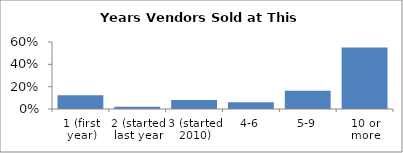
| Category | Series 0 |
|---|---|
| 1 (first year) | 0.122 |
| 2 (started last year | 0.02 |
| 3 (started 2010) | 0.082 |
| 4-6 | 0.061 |
| 5-9 | 0.163 |
| 10 or more | 0.551 |